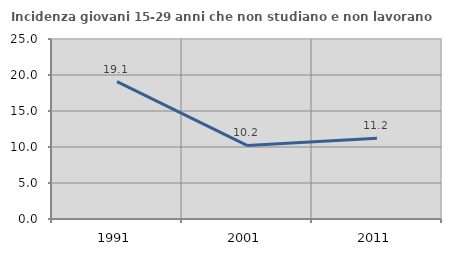
| Category | Incidenza giovani 15-29 anni che non studiano e non lavorano  |
|---|---|
| 1991.0 | 19.079 |
| 2001.0 | 10.215 |
| 2011.0 | 11.204 |